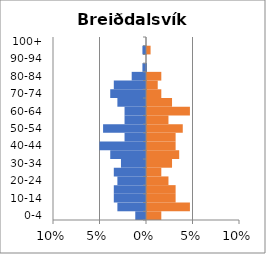
| Category | % Men | % Women |
|---|---|---|
| 0-4 | -0.012 | 0.015 |
| 5-9 | -0.031 | 0.046 |
| 10-14 | -0.035 | 0.031 |
| 15-19 | -0.035 | 0.031 |
| 20-24 | -0.031 | 0.023 |
| 25-29 | -0.035 | 0.015 |
| 30-34 | -0.027 | 0.027 |
| 35-39 | -0.038 | 0.035 |
| 40-44 | -0.05 | 0.031 |
| 45-49 | -0.023 | 0.031 |
| 50-54 | -0.046 | 0.038 |
| 55-59 | -0.023 | 0.023 |
| 60-64 | -0.023 | 0.046 |
| 65-69 | -0.031 | 0.027 |
| 70-74 | -0.038 | 0.015 |
| 75-79 | -0.035 | 0.012 |
| 80-84 | -0.015 | 0.015 |
| 85-89 | -0.004 | 0 |
| 90-94 | 0 | 0 |
| 95-99 | -0.004 | 0.004 |
| 100+ | 0 | 0 |